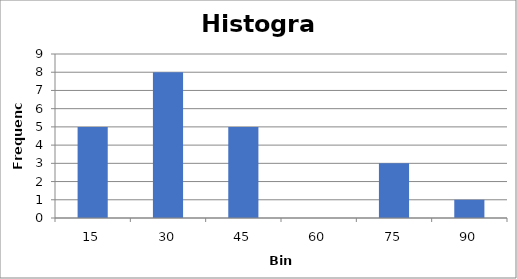
| Category | Series 0 |
|---|---|
| 15.0 | 5 |
| 30.0 | 8 |
| 45.0 | 5 |
| 60.0 | 0 |
| 75.0 | 3 |
| 90.0 | 1 |